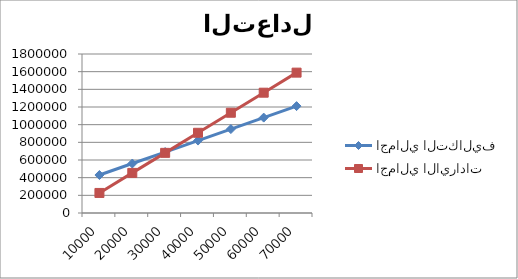
| Category | اجمالي التكاليف | اجمالي الايرادات |
|---|---|---|
| 10000.0 | 430000 | 227000 |
| 20000.0 | 560000 | 454000 |
| 30000.0 | 690000 | 681000 |
| 40000.0 | 820000 | 908000 |
| 50000.0 | 950000 | 1135000 |
| 60000.0 | 1080000 | 1362000 |
| 70000.0 | 1210000 | 1589000 |